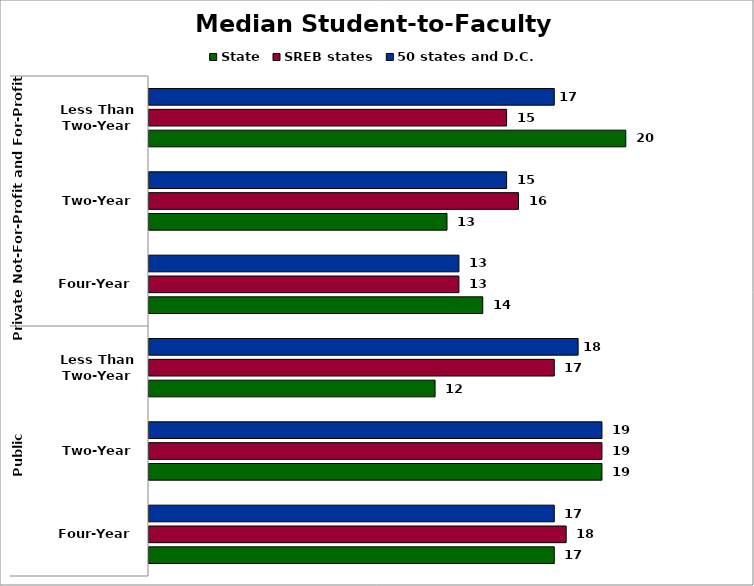
| Category | State | SREB states | 50 states and D.C. |
|---|---|---|---|
| 0 | 17 | 17.5 | 17 |
| 1 | 19 | 19 | 19 |
| 2 | 12 | 17 | 18 |
| 3 | 14 | 13 | 13 |
| 4 | 12.5 | 15.5 | 15 |
| 5 | 20 | 15 | 17 |